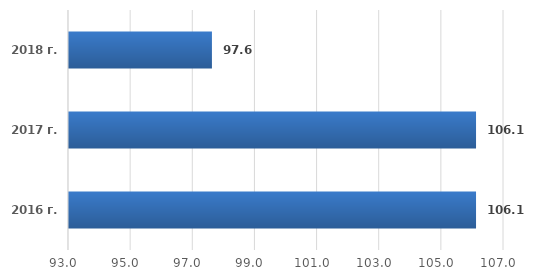
| Category | Series 0 |
|---|---|
| 2016 г. | 106.1 |
| 2017 г. | 106.1 |
| 2018 г. | 97.6 |